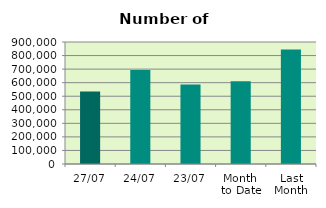
| Category | Series 0 |
|---|---|
| 27/07 | 534788 |
| 24/07 | 693668 |
| 23/07 | 587152 |
| Month 
to Date | 611219.368 |
| Last
Month | 844726.818 |